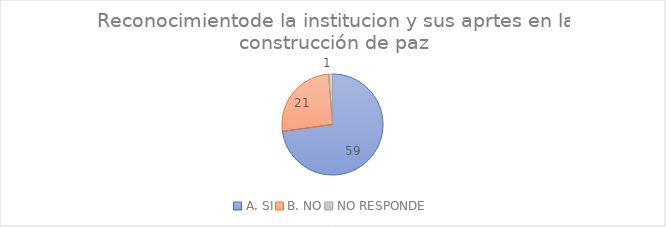
| Category | Series 0 |
|---|---|
| A. SI | 59 |
| B. NO | 21 |
| NO RESPONDE | 1 |